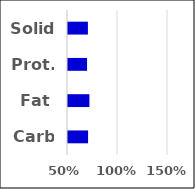
| Category | Value |
|---|---|
| Carb | 0.701 |
| Fat | 0.714 |
| Prot. | 0.691 |
| Solid | 0.699 |